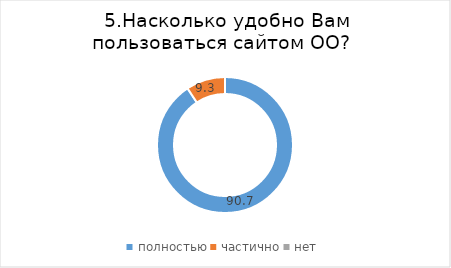
| Category | Series 0 |
|---|---|
| полностью | 90.698 |
| частично | 9.302 |
| нет | 0 |